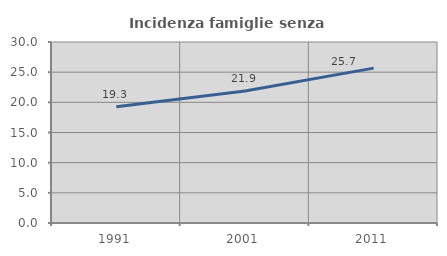
| Category | Incidenza famiglie senza nuclei |
|---|---|
| 1991.0 | 19.268 |
| 2001.0 | 21.888 |
| 2011.0 | 25.669 |